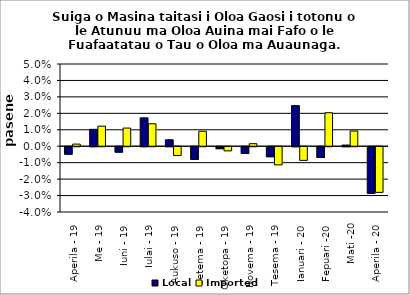
| Category | Local | Imported |
|---|---|---|
| Aperila - 19 | -0.005 | 0.001 |
| Me - 19 | 0.01 | 0.012 |
| Iuni - 19 | -0.003 | 0.011 |
| Iulai - 19 | 0.017 | 0.014 |
| Aukuso - 19 | 0.004 | -0.005 |
| Setema - 19 | -0.008 | 0.009 |
| Oketopa - 19 | -0.001 | -0.003 |
| Novema - 19 | -0.004 | 0.002 |
| Tesema - 19 | -0.006 | -0.011 |
| Ianuari - 20 | 0.025 | -0.008 |
| Fepuari -20 | -0.007 | 0.02 |
| Mati -20 | 0.001 | 0.009 |
| Aperila - 20 | -0.028 | -0.028 |